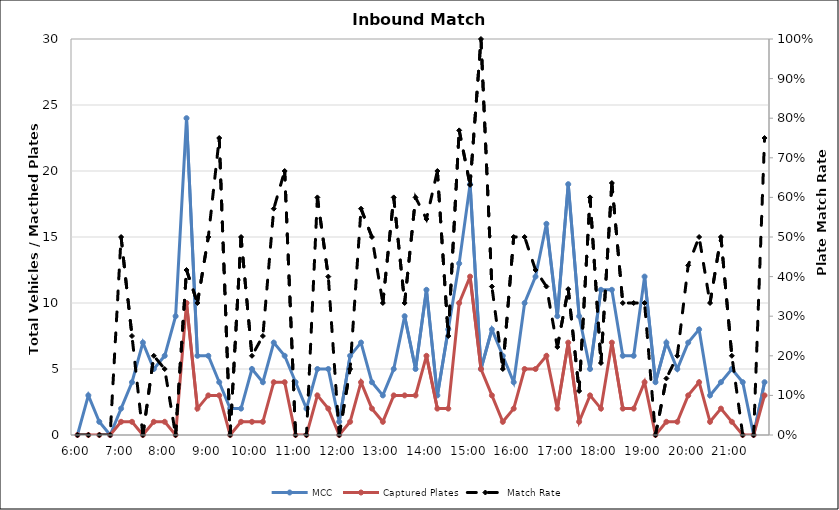
| Category | MCC | Captured Plates |
|---|---|---|
| 0.25 | 0 | 0 |
| 0.260416666666667 | 3 | 0 |
| 0.270833333333333 | 1 | 0 |
| 0.28125 | 0 | 0 |
| 0.291666666666667 | 2 | 1 |
| 0.302083333333333 | 4 | 1 |
| 0.3125 | 7 | 0 |
| 0.322916666666667 | 5 | 1 |
| 0.333333333333333 | 6 | 1 |
| 0.34375 | 9 | 0 |
| 0.354166666666667 | 24 | 10 |
| 0.364583333333333 | 6 | 2 |
| 0.375 | 6 | 3 |
| 0.385416666666667 | 4 | 3 |
| 0.395833333333333 | 2 | 0 |
| 0.40625 | 2 | 1 |
| 0.416666666666667 | 5 | 1 |
| 0.427083333333333 | 4 | 1 |
| 0.4375 | 7 | 4 |
| 0.447916666666667 | 6 | 4 |
| 0.458333333333333 | 4 | 0 |
| 0.46875 | 2 | 0 |
| 0.479166666666667 | 5 | 3 |
| 0.489583333333333 | 5 | 2 |
| 0.5 | 1 | 0 |
| 0.510416666666667 | 6 | 1 |
| 0.520833333333333 | 7 | 4 |
| 0.53125 | 4 | 2 |
| 0.541666666666667 | 3 | 1 |
| 0.552083333333333 | 5 | 3 |
| 0.5625 | 9 | 3 |
| 0.572916666666667 | 5 | 3 |
| 0.583333333333333 | 11 | 6 |
| 0.59375 | 3 | 2 |
| 0.604166666666667 | 8 | 2 |
| 0.614583333333333 | 13 | 10 |
| 0.625 | 19 | 12 |
| 0.635416666666667 | 5 | 5 |
| 0.645833333333333 | 8 | 3 |
| 0.65625 | 6 | 1 |
| 0.666666666666667 | 4 | 2 |
| 0.677083333333333 | 10 | 5 |
| 0.6875 | 12 | 5 |
| 0.697916666666667 | 16 | 6 |
| 0.708333333333333 | 9 | 2 |
| 0.71875 | 19 | 7 |
| 0.729166666666667 | 9 | 1 |
| 0.739583333333333 | 5 | 3 |
| 0.75 | 11 | 2 |
| 0.760416666666667 | 11 | 7 |
| 0.770833333333333 | 6 | 2 |
| 0.78125 | 6 | 2 |
| 0.791666666666667 | 12 | 4 |
| 0.802083333333333 | 4 | 0 |
| 0.8125 | 7 | 1 |
| 0.822916666666667 | 5 | 1 |
| 0.833333333333333 | 7 | 3 |
| 0.84375 | 8 | 4 |
| 0.854166666666667 | 3 | 1 |
| 0.864583333333333 | 4 | 2 |
| 0.875 | 5 | 1 |
| 0.885416666666667 | 4 | 0 |
| 0.895833333333333 | 0 | 0 |
| 0.90625 | 4 | 3 |